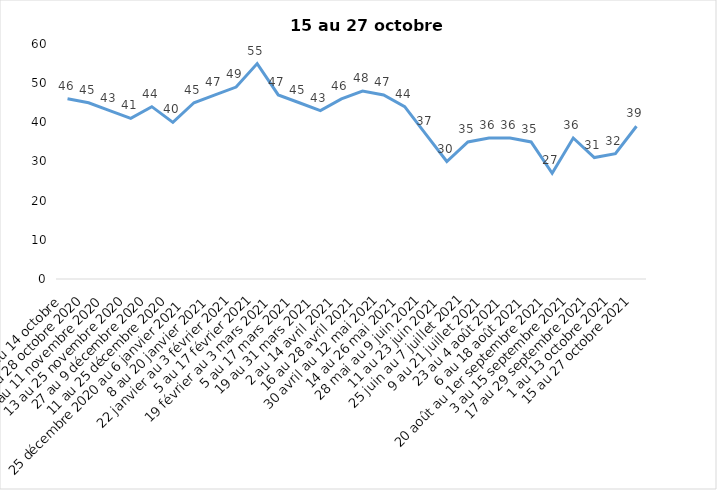
| Category | Toujours aux trois mesures |
|---|---|
| 2 au 14 octobre  | 46 |
| 16 au 28 octobre 2020 | 45 |
| 30 octobre au 11 novembre 2020 | 43 |
| 13 au 25 novembre 2020 | 41 |
| 27 au 9 décembre 2020 | 44 |
| 11 au 25 décembre 2020 | 40 |
| 25 décembre 2020 au 6 janvier 2021 | 45 |
| 8 au 20 janvier 2021 | 47 |
| 22 janvier au 3 février 2021 | 49 |
| 5 au 17 février 2021 | 55 |
| 19 février au 3 mars 2021 | 47 |
| 5 au 17 mars 2021 | 45 |
| 19 au 31 mars 2021 | 43 |
| 2 au 14 avril 2021 | 46 |
| 16 au 28 avril 2021 | 48 |
| 30 avril au 12 mai 2021 | 47 |
| 14 au 26 mai 2021 | 44 |
| 28 mai au 9 juin 2021 | 37 |
| 11 au 23 juin 2021 | 30 |
| 25 juin au 7 juillet 2021 | 35 |
| 9 au 21 juillet 2021 | 36 |
| 23 au 4 août 2021 | 36 |
| 6 au 18 août 2021 | 35 |
| 20 août au 1er septembre 2021 | 27 |
| 3 au 15 septembre 2021 | 36 |
| 17 au 29 septembre 2021 | 31 |
| 1 au 13 octobre 2021 | 32 |
| 15 au 27 octobre 2021 | 39 |